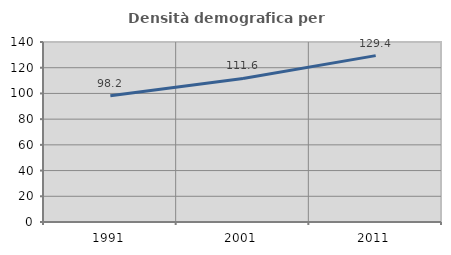
| Category | Densità demografica |
|---|---|
| 1991.0 | 98.229 |
| 2001.0 | 111.636 |
| 2011.0 | 129.404 |